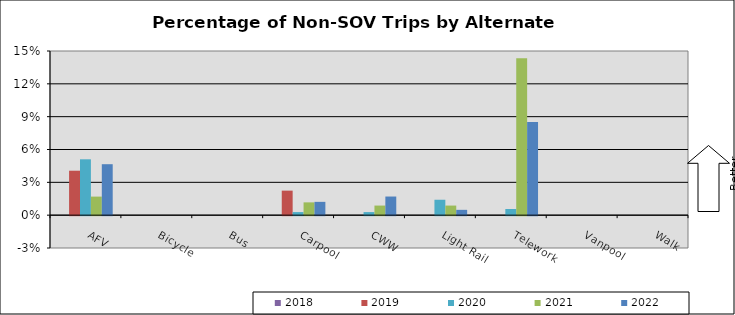
| Category | 2018 | 2019 | 2020 | 2021 | 2022 |
|---|---|---|---|---|---|
| AFV | 0 | 0.041 | 0.051 | 0.017 | 0.047 |
| Bicycle | 0 | 0 | 0 | 0 | 0 |
| Bus | 0 | 0 | 0 | 0 | 0 |
| Carpool | 0 | 0.022 | 0.003 | 0.012 | 0.012 |
| CWW | 0 | 0 | 0.003 | 0.009 | 0.017 |
| Light Rail | 0 | 0 | 0.014 | 0.009 | 0.005 |
| Telework | 0 | 0 | 0.006 | 0.143 | 0.085 |
| Vanpool | 0 | 0 | 0 | 0 | 0 |
| Walk | 0 | 0 | 0 | 0 | 0 |